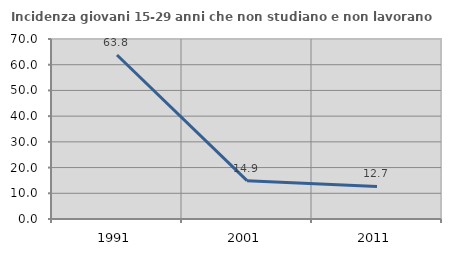
| Category | Incidenza giovani 15-29 anni che non studiano e non lavorano  |
|---|---|
| 1991.0 | 63.784 |
| 2001.0 | 14.904 |
| 2011.0 | 12.667 |